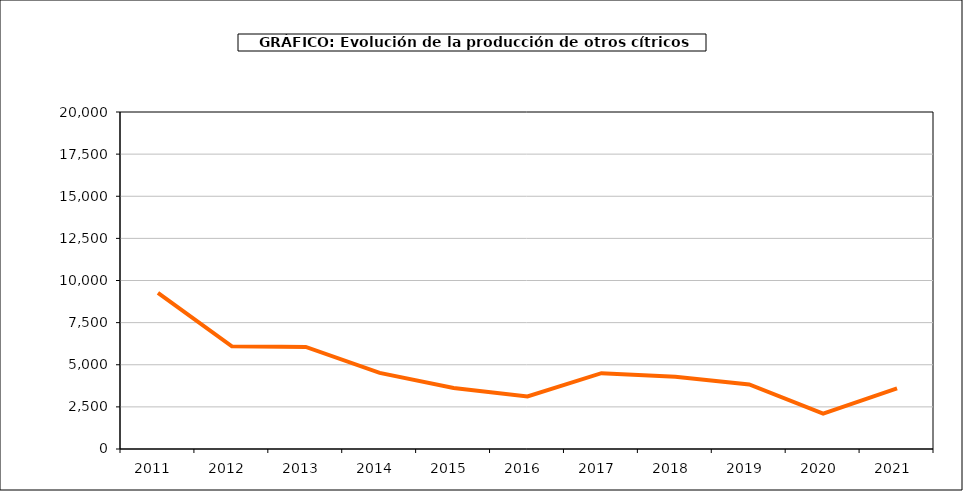
| Category | producción |
|---|---|
| 2011.0 | 9260 |
| 2012.0 | 6091 |
| 2013.0 | 6060 |
| 2014.0 | 4514 |
| 2015.0 | 3626 |
| 2016.0 | 3116 |
| 2017.0 | 4501 |
| 2018.0 | 4287 |
| 2019.0 | 3828 |
| 2020.0 | 2103 |
| 2021.0 | 3592 |